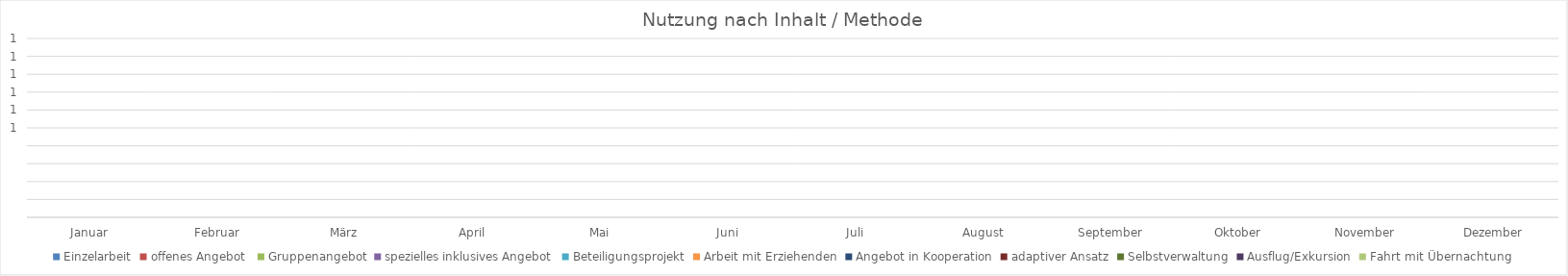
| Category | Einzelarbeit | offenes Angebot  | Gruppenangebot | spezielles inklusives Angebot | Beteiligungsprojekt | Arbeit mit Erziehenden | Angebot in Kooperation | adaptiver Ansatz | Selbstverwaltung | Ausflug/Exkursion | Fahrt mit Übernachtung |
|---|---|---|---|---|---|---|---|---|---|---|---|
| Januar | 0 | 0 | 0 | 0 | 0 | 0 | 0 | 0 | 0 | 0 | 0 |
| Februar | 0 | 0 | 0 | 0 | 0 | 0 | 0 | 0 | 0 | 0 | 0 |
| März | 0 | 0 | 0 | 0 | 0 | 0 | 0 | 0 | 0 | 0 | 0 |
| April | 0 | 0 | 0 | 0 | 0 | 0 | 0 | 0 | 0 | 0 | 0 |
| Mai | 0 | 0 | 0 | 0 | 0 | 0 | 0 | 0 | 0 | 0 | 0 |
| Juni | 0 | 0 | 0 | 0 | 0 | 0 | 0 | 0 | 0 | 0 | 0 |
| Juli | 0 | 0 | 0 | 0 | 0 | 0 | 0 | 0 | 0 | 0 | 0 |
| August | 0 | 0 | 0 | 0 | 0 | 0 | 0 | 0 | 0 | 0 | 0 |
| September | 0 | 0 | 0 | 0 | 0 | 0 | 0 | 0 | 0 | 0 | 0 |
| Oktober | 0 | 0 | 0 | 0 | 0 | 0 | 0 | 0 | 0 | 0 | 0 |
| November | 0 | 0 | 0 | 0 | 0 | 0 | 0 | 0 | 0 | 0 | 0 |
| Dezember | 0 | 0 | 0 | 0 | 0 | 0 | 0 | 0 | 0 | 0 | 0 |